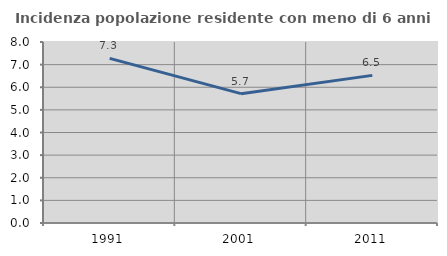
| Category | Incidenza popolazione residente con meno di 6 anni |
|---|---|
| 1991.0 | 7.276 |
| 2001.0 | 5.716 |
| 2011.0 | 6.525 |